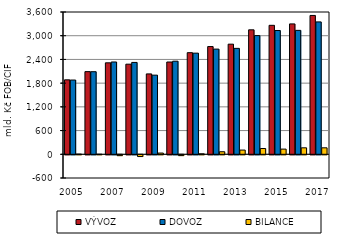
| Category | VÝVOZ | DOVOZ | BILANCE |
|---|---|---|---|
| 2005.0 | 1883.79 | 1878.625 | 5.165 |
| 2006.0 | 2091.052 | 2089.252 | 1.8 |
| 2007.0 | 2314.157 | 2335.398 | -21.241 |
| 2008.0 | 2279.85 | 2324.182 | -44.332 |
| 2009.0 | 2033.354 | 2002.287 | 31.067 |
| 2010.0 | 2334.842 | 2355.421 | -20.579 |
| 2011.0 | 2570.941 | 2558.964 | 11.977 |
| 2012.0 | 2725.844 | 2661.432 | 64.412 |
| 2013.0 | 2786.229 | 2679.71 | 106.518 |
| 2014.0 | 3149.196 | 3003.188 | 146.008 |
| 2015.0 | 3262.971 | 3131.994 | 130.977 |
| 2016.0 | 3299.106 | 3135.452 | 163.654 |
| 2017.0 | 3512.897 | 3349.431 | 163.466 |